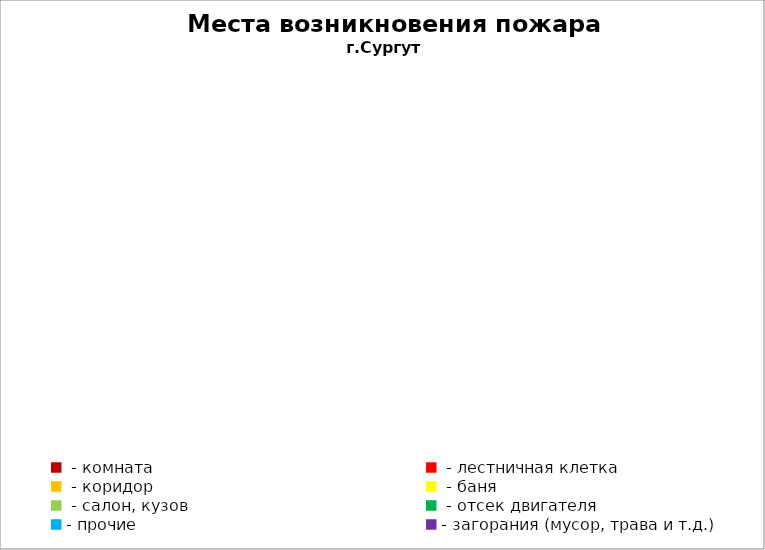
| Category | Места возникновения пожара |
|---|---|
|  - комната | 63 |
|  - лестничная клетка | 29 |
|  - коридор | 4 |
|  - баня | 43 |
|  - салон, кузов | 25 |
|  - отсек двигателя | 28 |
| - прочие | 102 |
| - загорания (мусор, трава и т.д.)  | 172 |